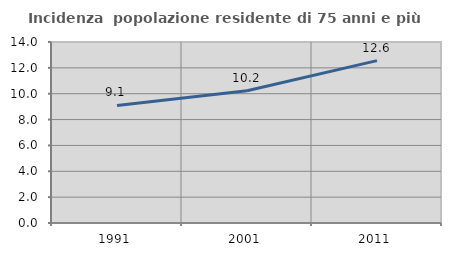
| Category | Incidenza  popolazione residente di 75 anni e più |
|---|---|
| 1991.0 | 9.091 |
| 2001.0 | 10.229 |
| 2011.0 | 12.56 |